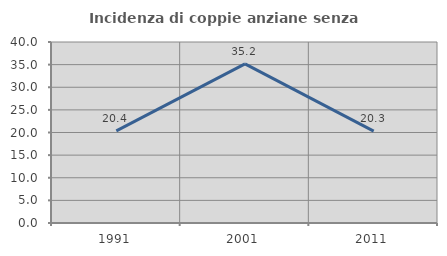
| Category | Incidenza di coppie anziane senza figli  |
|---|---|
| 1991.0 | 20.354 |
| 2001.0 | 35.165 |
| 2011.0 | 20.312 |